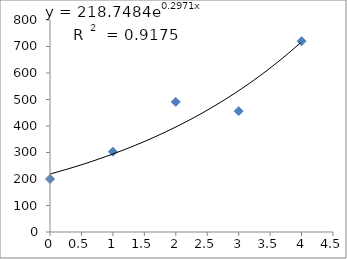
| Category | Series 0 |
|---|---|
| 0.0 | 200 |
| 1.0 | 303 |
| 2.0 | 491 |
| 3.0 | 456 |
| 4.0 | 720 |